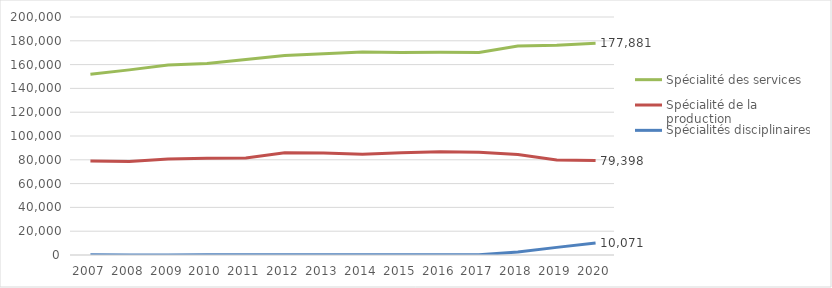
| Category | Spécialité des services | Spécialité de la production | Spécialités disciplinaires |
|---|---|---|---|
| 2007.0 | 151867 | 78896 | 114 |
| 2008.0 | 155563 | 78523 | 94 |
| 2009.0 | 159603 | 80618 | 101 |
| 2010.0 | 160923 | 81206 | 118 |
| 2011.0 | 164373 | 81516 | 136 |
| 2012.0 | 167608 | 85993 | 129 |
| 2013.0 | 169180 | 85654 | 133 |
| 2014.0 | 170495 | 84584 | 137 |
| 2015.0 | 170090 | 85839 | 137 |
| 2016.0 | 170339 | 86768 | 140 |
| 2017.0 | 170157 | 86259 | 147 |
| 2018.0 | 175622 | 84493 | 2511 |
| 2019.0 | 176231 | 79856 | 6411 |
| 2020.0 | 177881 | 79398 | 10071 |